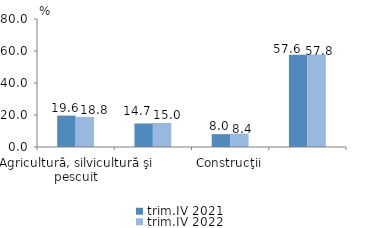
| Category | trim.IV 2021 | trim.IV 2022 |
|---|---|---|
| Agricultură, silvicultură şi pescuit | 19.639 | 18.824 |
| Industrie | 14.708 | 15.005 |
| Construcţii | 8.039 | 8.392 |
| Servicii | 57.614 | 57.779 |